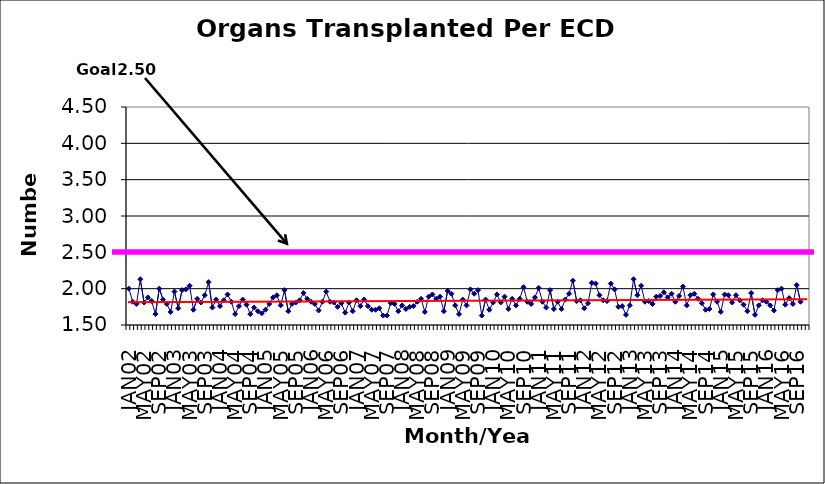
| Category | Series 0 |
|---|---|
| JAN02 | 2 |
| FEB02 | 1.82 |
| MAR02 | 1.79 |
| APR02 | 2.13 |
| MAY02 | 1.81 |
| JUN02 | 1.88 |
| JUL02 | 1.83 |
| AUG02 | 1.65 |
| SEP02 | 2 |
| OCT02 | 1.85 |
| NOV02 | 1.79 |
| DEC02 | 1.68 |
| JAN03 | 1.96 |
| FEB03 | 1.73 |
| MAR03 | 1.98 |
| APR03 | 1.99 |
| MAY03 | 2.04 |
| JUN03 | 1.71 |
| JUL03 | 1.86 |
| AUG03 | 1.81 |
| SEP03 | 1.91 |
| OCT03 | 2.09 |
| NOV03 | 1.74 |
| DEC03 | 1.85 |
| JAN04 | 1.76 |
| FEB04 | 1.84 |
| MAR04 | 1.92 |
| APR04 | 1.82 |
| MAY04 | 1.65 |
| JUN04 | 1.76 |
| JUL04 | 1.85 |
| AUG04 | 1.78 |
| SEP04 | 1.65 |
| OCT04 | 1.74 |
| NOV04 | 1.69 |
| DEC04 | 1.66 |
| JAN05 | 1.71 |
| FEB05 | 1.79 |
| MAR05 | 1.88 |
| APR05 | 1.91 |
| MAY05 | 1.77 |
| JUN05 | 1.98 |
| JUL05 | 1.69 |
| AUG05 | 1.79 |
| SEP05 | 1.81 |
| OCT05 | 1.84 |
| NOV05 | 1.94 |
| DEC05 | 1.86 |
| JAN06 | 1.82 |
| FEB06 | 1.79 |
| MAR06 | 1.7 |
| APR06 | 1.82 |
| MAY06 | 1.96 |
| JUN06 | 1.82 |
| JUL06 | 1.81 |
| AUG06 | 1.75 |
| SEP06 | 1.8 |
| OCT06 | 1.67 |
| NOV06 | 1.81 |
| DEC06 | 1.69 |
| JAN07 | 1.84 |
| FEB07 | 1.76 |
| MAR07 | 1.85 |
| APR07 | 1.76 |
| MAY07 | 1.71 |
| JUN07 | 1.71 |
| JUL07 | 1.73 |
| AUG07 | 1.63 |
| SEP07 | 1.63 |
| OCT07 | 1.8 |
| NOV07 | 1.79 |
| DEC07 | 1.69 |
| JAN08 | 1.77 |
| FEB08 | 1.72 |
| MAR08 | 1.75 |
| APR08 | 1.76 |
| MAY08 | 1.82 |
| JUN08 | 1.86 |
| JUL08 | 1.68 |
| AUG08 | 1.89 |
| SEP08 | 1.92 |
| OCT08 | 1.86 |
| NOV08 | 1.89 |
| DEC08 | 1.69 |
| JAN09 | 1.97 |
| FEB09 | 1.93 |
| MAR09 | 1.77 |
| APR09 | 1.65 |
| MAY09 | 1.85 |
| JUN09 | 1.77 |
| JUL09 | 1.99 |
| AUG09 | 1.93 |
| SEP09 | 1.98 |
| OCT09 | 1.63 |
| NOV09 | 1.85 |
| DEC09 | 1.71 |
| JAN10 | 1.81 |
| FEB10 | 1.92 |
| MAR10 | 1.81 |
| APR10 | 1.89 |
| MAY10 | 1.72 |
| JUN10 | 1.86 |
| JUL10 | 1.77 |
| AUG10 | 1.86 |
| SEP10 | 2.02 |
| OCT10 | 1.82 |
| NOV10 | 1.79 |
| DEC10 | 1.88 |
| JAN11 | 2.01 |
| FEB11 | 1.82 |
| MAR11 | 1.74 |
| APR11 | 1.98 |
| MAY11 | 1.72 |
| JUN11 | 1.82 |
| JUL11 | 1.72 |
| AUG11 | 1.85 |
| SEP11 | 1.93 |
| OCT11 | 2.11 |
| NOV11 | 1.83 |
| DEC11 | 1.84 |
| JAN12 | 1.73 |
| FEB12 | 1.8 |
| MAR12 | 2.08 |
| APR12 | 2.07 |
| MAY12 | 1.91 |
| JUN12 | 1.84 |
| JUL12 | 1.83 |
| AUG12 | 2.07 |
| SEP12 | 1.99 |
| OCT12 | 1.75 |
| NOV12 | 1.76 |
| DEC12 | 1.64 |
| JAN13 | 1.77 |
| FEB13 | 2.13 |
| MAR13 | 1.91 |
| APR13 | 2.04 |
| MAY13 | 1.82 |
| JUN13 | 1.83 |
| JUL13 | 1.79 |
| AUG13 | 1.89 |
| SEP13 | 1.9 |
| OCT13 | 1.95 |
| NOV13 | 1.88 |
| DEC13 | 1.93 |
| JAN14 | 1.82 |
| FEB14 | 1.9 |
| MAR14 | 2.03 |
| APR14 | 1.77 |
| MAY14 | 1.91 |
| JUN14 | 1.93 |
| JUL14 | 1.86 |
| AUG14 | 1.8 |
| SEP14 | 1.71 |
| OCT14 | 1.72 |
| NOV14 | 1.92 |
| DEC14 | 1.82 |
| JAN15 | 1.68 |
| FEB15 | 1.92 |
| MAR15 | 1.91 |
| APR15 | 1.81 |
| MAY15 | 1.91 |
| JUN15 | 1.84 |
| JUL15 | 1.78 |
| AUG15 | 1.69 |
| SEP15 | 1.94 |
| OCT15 | 1.64 |
| NOV15 | 1.77 |
| DEC15 | 1.84 |
| JAN16 | 1.82 |
| FEB16 | 1.77 |
| MAR16 | 1.7 |
| APR16 | 1.98 |
| MAY16 | 2 |
| JUN16 | 1.78 |
| JUL16 | 1.87 |
| AUG16 | 1.79 |
| SEP16 | 2.05 |
| OCT16 | 1.82 |